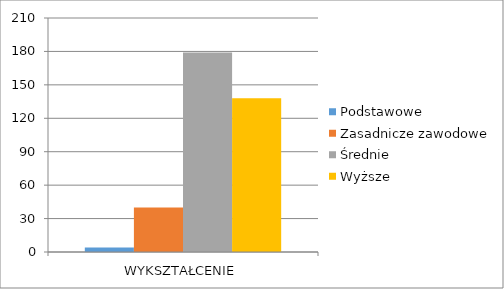
| Category | Podstawowe | Zasadnicze zawodowe | Średnie | Wyższe |
|---|---|---|---|---|
| WYKSZTAŁCENIE | 4 | 40 | 179 | 138 |